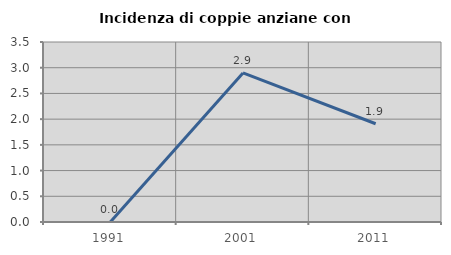
| Category | Incidenza di coppie anziane con figli |
|---|---|
| 1991.0 | 0 |
| 2001.0 | 2.899 |
| 2011.0 | 1.911 |